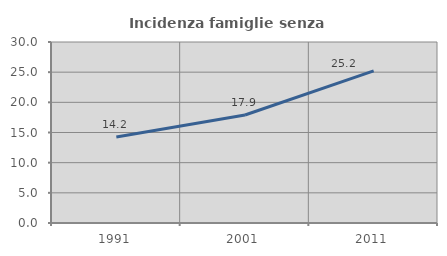
| Category | Incidenza famiglie senza nuclei |
|---|---|
| 1991.0 | 14.243 |
| 2001.0 | 17.899 |
| 2011.0 | 25.201 |